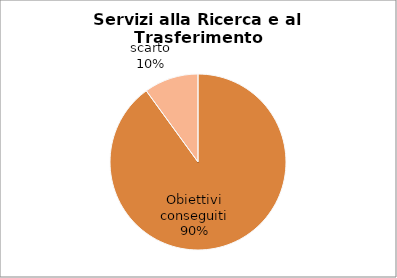
| Category | Series 0 |
|---|---|
| Obiettivi conseguiti | 90 |
| scarto | 10 |